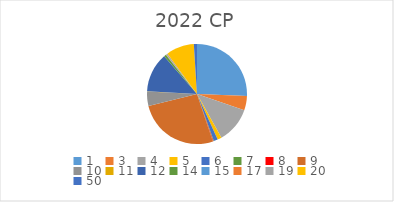
| Category | Series 0 |
|---|---|
| 1.0 | 2547580 |
| 3.0 | 459854 |
| 4.0 | 1151307 |
| 5.0 | 132887 |
| 6.0 | 131555 |
| 7.0 | 15000 |
| 8.0 | 15000 |
| 9.0 | 2614115 |
| 10.0 | 457960 |
| 11.0 | 6000 |
| 12.0 | 1267699 |
| 14.0 | 69938 |
| 15.0 | 7100 |
| 17.0 | 6954 |
| 19.0 | 48000 |
| 20.0 | 898327 |
| 50.0 | 101390 |